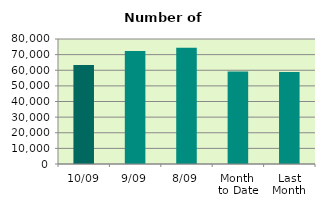
| Category | Series 0 |
|---|---|
| 10/09 | 63348 |
| 9/09 | 72374 |
| 8/09 | 74328 |
| Month 
to Date | 59257.75 |
| Last
Month | 58874.818 |